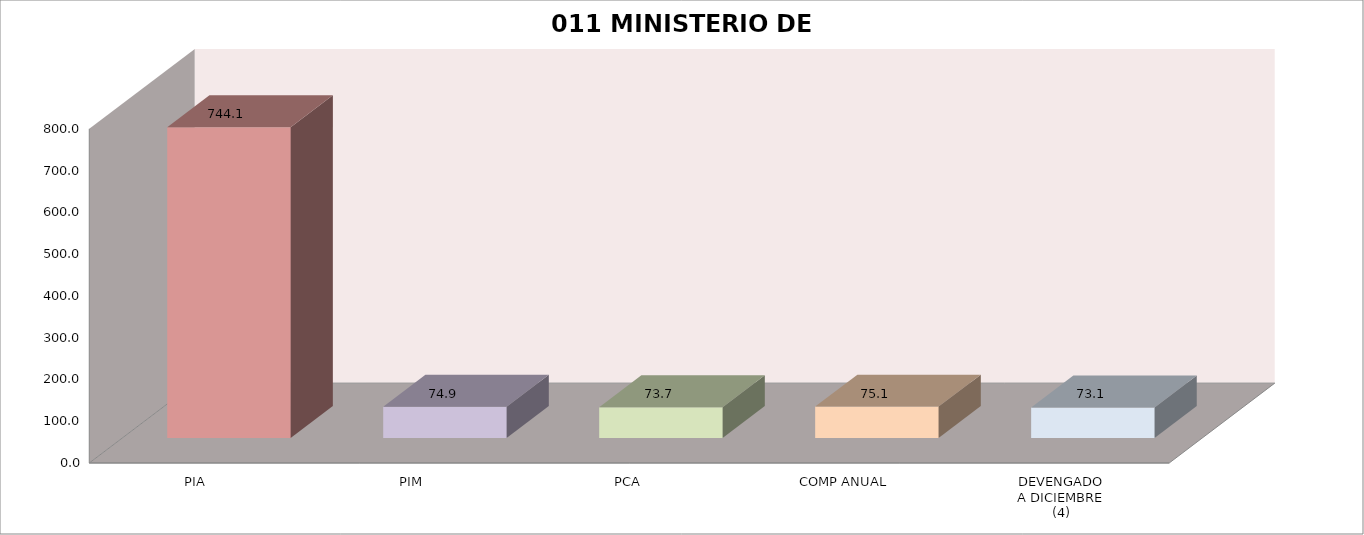
| Category | 011 MINISTERIO DE SALUD |
|---|---|
| PIA | 744.088 |
| PIM | 74.88 |
| PCA | 73.686 |
| COMP ANUAL | 75.14 |
| DEVENGADO
A DICIEMBRE
(4) | 73.137 |